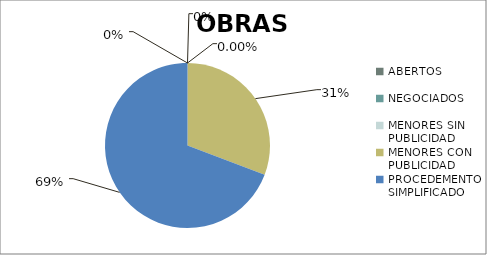
| Category | Series 0 |
|---|---|
| ABERTOS  | 0 |
| NEGOCIADOS  | 0 |
| MENORES SIN PUBLICIDAD | 0 |
| MENORES CON PUBLICIDAD | 0.308 |
| PROCEDEMENTO SIMPLIFICADO | 0.692 |